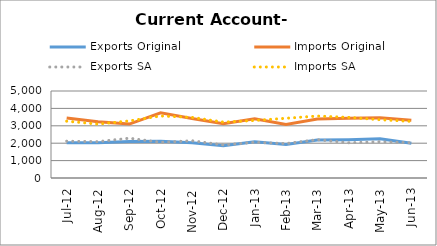
| Category | Exports Original | Imports Original | Exports SA | Imports SA |
|---|---|---|---|---|
| 2012-07-11 | 2020 | 3446 | 2115 | 3266 |
| 2012-08-11 | 2030 | 3232 | 2089 | 3098 |
| 2012-09-11 | 2101 | 3098 | 2287 | 3281 |
| 2012-10-11 | 2117 | 3742 | 2050 | 3565 |
| 2012-11-11 | 2027 | 3425 | 2140 | 3484 |
| 2012-12-11 | 1859 | 3117 | 1901 | 3212 |
| 2013-01-11 | 2085 | 3402 | 2052 | 3306 |
| 2013-02-11 | 1930 | 3077 | 1980 | 3433 |
| 2013-03-11 | 2177 | 3392 | 2202 | 3560 |
| 2013-04-11 | 2204 | 3441 | 2025 | 3484 |
| 2013-05-11 | 2258 | 3468 | 2083 | 3350 |
| 2013-06-11 | 1994 | 3317 | 2027 | 3253 |